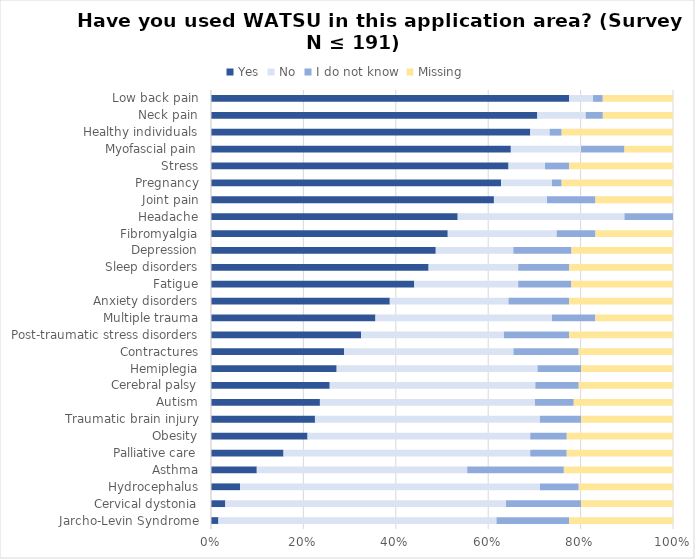
| Category | Yes | No | I do not know | Missing |
|---|---|---|---|---|
| Low back pain | 77.5 | 5.2 | 2.1 | 15.2 |
| Neck pain | 70.7 | 10.5 | 3.7 | 15.2 |
| Healthy individuals | 69.1 | 4.2 | 2.6 | 24.1 |
| Myofascial pain | 64.9 | 15.2 | 9.4 | 10.5 |
| Stress | 64.4 | 7.9 | 5.2 | 22.5 |
| Pregnancy | 62.8 | 11 | 2.1 | 24.1 |
| Joint pain | 61.3 | 11.5 | 10.5 | 16.8 |
| Headache | 53.4 | 36.1 | 10.5 | 0 |
| Fibromyalgia | 51.3 | 23.6 | 8.4 | 16.8 |
| Depression | 48.7 | 16.8 | 12.6 | 22 |
| Sleep disorders | 47.1 | 19.4 | 11 | 22.5 |
| Fatigue | 44 | 22.5 | 11.5 | 22 |
| Anxiety disorders | 38.7 | 25.7 | 13.1 | 22.5 |
| Multiple trauma | 35.6 | 38.2 | 9.4 | 16.8 |
| Post-traumatic stress disorders | 32.5 | 30.9 | 14.1 | 22.5 |
| Contractures | 28.8 | 36.6 | 14.1 | 20.4 |
| Hemiplegia | 27.2 | 43.5 | 9.4 | 19.9 |
| Cerebral palsy | 25.7 | 44.5 | 9.4 | 20.4 |
| Autism | 23.6 | 46.6 | 8.4 | 21.5 |
| Traumatic brain injury | 22.5 | 48.7 | 8.9 | 19.9 |
| Obesity | 20.9 | 48.2 | 7.9 | 23 |
| Palliative care | 15.7 | 53.4 | 7.9 | 23 |
| Asthma | 9.9 | 45.5 | 20.9 | 23.6 |
| Hydrocephalus | 6.3 | 64.9 | 8.4 | 20.4 |
| Cervical dystonia | 3.1 | 60.7 | 16.2 | 19.9 |
| Jarcho-Levin Syndrome | 1.6 | 60.2 | 15.7 | 22.5 |